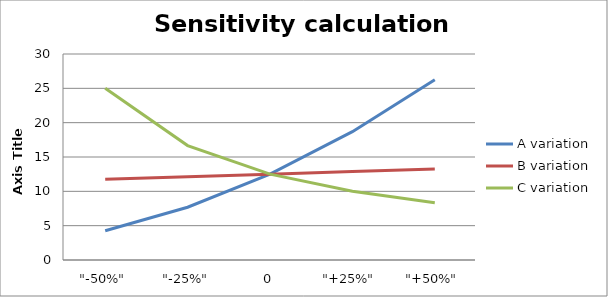
| Category | A variation | B variation | C variation |
|---|---|---|---|
| "-50%" | 4.25 | 11.75 | 25 |
| "-25%" | 7.688 | 12.125 | 16.667 |
| 0 | 12.5 | 12.5 | 12.5 |
| "+25%" | 18.688 | 12.875 | 10 |
| "+50%" | 26.25 | 13.25 | 8.333 |